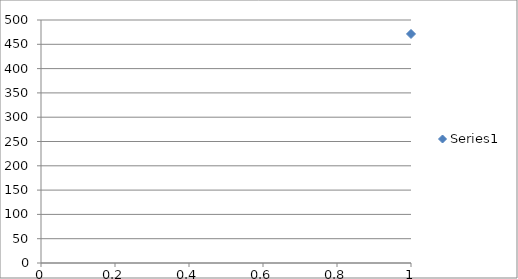
| Category | Series 0 |
|---|---|
| 0 | 471.23 |
| 1 | 448.68 |
| 2 | 425.78 |
| 3 | 402.72 |
| 4 | 379.52 |
| 5 | 356.25 |
| 6 | 332.94 |
| 7 | 309.6 |
| 8 | 286.21 |
| 9 | 262.91 |
| 10 | 239.41 |
| 11 | 215.9 |
| 12 | 192.43 |
| 13 | 168.87 |
| 14 | 145.31 |
| 15 | 121.76 |
| 16 | 98.17 |
| 17 | 74.5 |
| 18 | 50.87 |
| 19 | 27.24 |
| 20 | 3.5 |